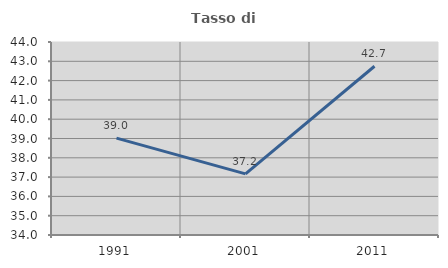
| Category | Tasso di occupazione   |
|---|---|
| 1991.0 | 39.022 |
| 2001.0 | 37.167 |
| 2011.0 | 42.743 |